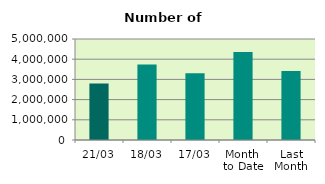
| Category | Series 0 |
|---|---|
| 21/03 | 2801728 |
| 18/03 | 3740196 |
| 17/03 | 3310288 |
| Month 
to Date | 4359188.133 |
| Last
Month | 3413232.3 |